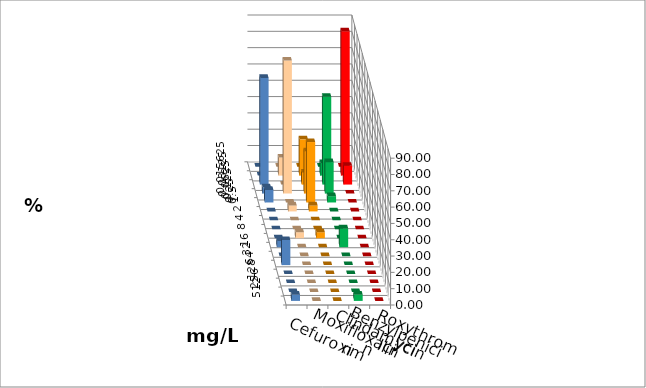
| Category | Cefuroxim | Moxifloxacin | Clindamycin | Benzylpenicillin | Roxythromycin |
|---|---|---|---|---|---|
| 0.015625 | 0 | 0 | 0 | 0 | 0 |
| 0.03125 | 11.111 | 22.222 | 7.692 | 88.462 | 0 |
| 0.0625 | 0 | 7.407 | 53.846 | 11.538 | 65.385 |
| 0.125 | 81.481 | 25.926 | 19.231 | 0 | 3.846 |
| 0.25 | 0 | 37.037 | 3.846 | 0 | 7.692 |
| 0.5 | 3.704 | 3.704 | 0 | 0 | 0 |
| 1.0 | 0 | 0 | 0 | 0 | 0 |
| 2.0 | 0 | 0 | 0 | 0 | 0 |
| 4.0 | 3.704 | 3.704 | 0 | 0 | 0 |
| 8.0 | 0 | 0 | 11.538 | 0 | 3.846 |
| 16.0 | 0 | 0 | 0 | 0 | 0 |
| 32.0 | 0 | 0 | 0 | 0 | 15.385 |
| 64.0 | 0 | 0 | 0 | 0 | 0 |
| 128.0 | 0 | 0 | 0 | 0 | 0 |
| 256.0 | 0 | 0 | 0 | 0 | 0 |
| 512.0 | 0 | 0 | 3.846 | 0 | 3.846 |